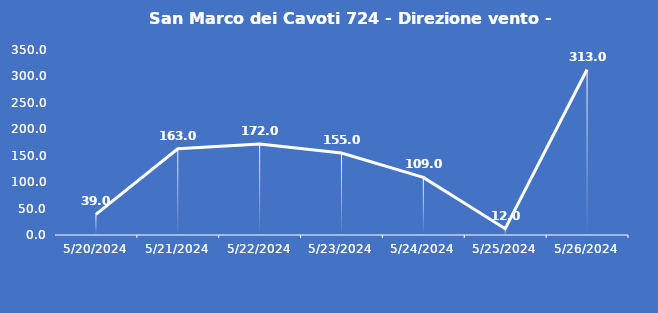
| Category | San Marco dei Cavoti 724 - Direzione vento - Grezzo (°N) |
|---|---|
| 5/20/24 | 39 |
| 5/21/24 | 163 |
| 5/22/24 | 172 |
| 5/23/24 | 155 |
| 5/24/24 | 109 |
| 5/25/24 | 12 |
| 5/26/24 | 313 |